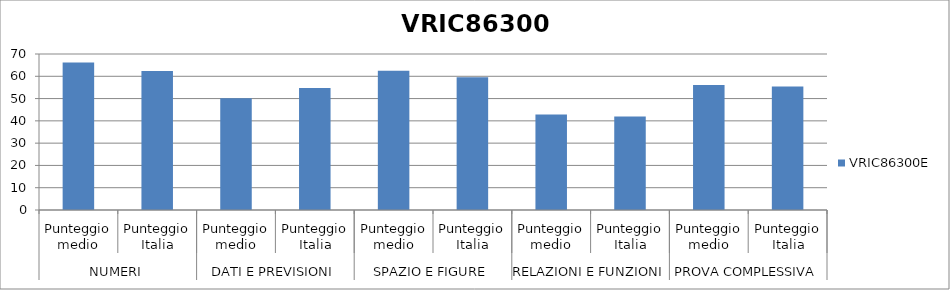
| Category | VRIC86300E |
|---|---|
| 0 | 66.2 |
| 1 | 62.4 |
| 2 | 50.1 |
| 3 | 54.7 |
| 4 | 62.5 |
| 5 | 59.6 |
| 6 | 42.9 |
| 7 | 42 |
| 8 | 56.1 |
| 9 | 55.4 |